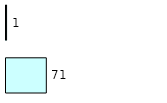
| Category | Series 0 | Series 1 |
|---|---|---|
| 0 | 71 | 1 |